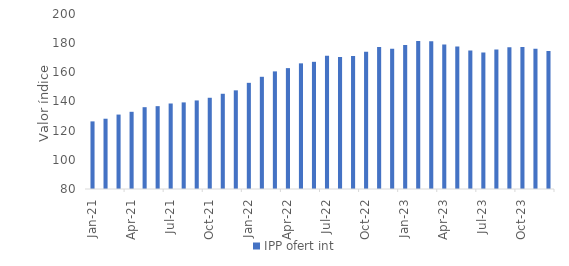
| Category | IPP ofert int |
|---|---|
| 2021-01-01 | 126.36 |
| 2021-02-01 | 128.19 |
| 2021-03-01 | 131.04 |
| 2021-04-01 | 132.94 |
| 2021-05-01 | 136.1 |
| 2021-06-01 | 136.81 |
| 2021-07-01 | 138.63 |
| 2021-08-01 | 139.38 |
| 2021-09-01 | 140.73 |
| 2021-10-01 | 142.56 |
| 2021-11-01 | 145.3 |
| 2021-12-01 | 147.65 |
| 2022-01-01 | 152.8 |
| 2022-02-01 | 156.94 |
| 2022-03-01 | 160.65 |
| 2022-04-01 | 162.89 |
| 2022-05-01 | 166.16 |
| 2022-06-01 | 167.21 |
| 2022-07-01 | 171.4 |
| 2022-08-01 | 170.53 |
| 2022-09-01 | 171.26 |
| 2022-10-01 | 174.12 |
| 2022-11-01 | 177.36 |
| 2022-12-01 | 176.17 |
| 2023-01-01 | 178.736 |
| 2023-02-01 | 181.43 |
| 2023-03-01 | 181.36 |
| 2023-04-01 | 179.17 |
| 2023-05-01 | 177.7 |
| 2023-06-01 | 174.91 |
| 2023-07-01 | 173.52 |
| 2023-08-01 | 175.6 |
| 2023-09-01 | 177.12 |
| 2023-10-01 | 177.43 |
| 2023-11-01 | 176.2 |
| 2023-12-01 | 174.58 |